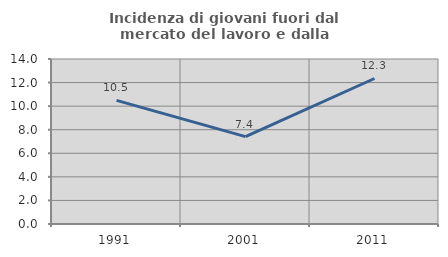
| Category | Incidenza di giovani fuori dal mercato del lavoro e dalla formazione  |
|---|---|
| 1991.0 | 10.488 |
| 2001.0 | 7.411 |
| 2011.0 | 12.346 |